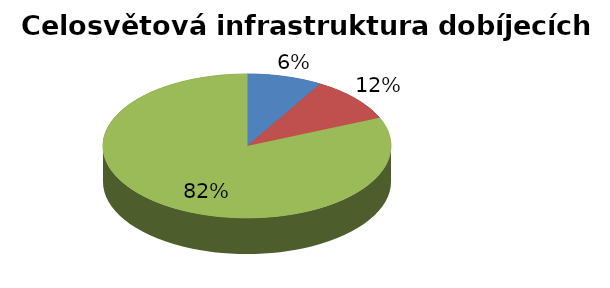
| Category | Series 0 |
|---|---|
| Supercharger | 567 |
| Combo | 680 |
| Chademo | 5467 |